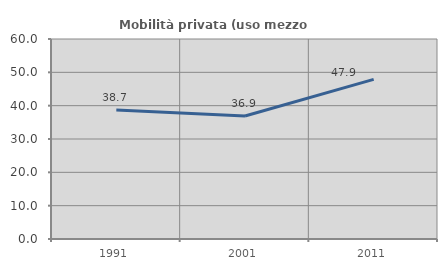
| Category | Mobilità privata (uso mezzo privato) |
|---|---|
| 1991.0 | 38.701 |
| 2001.0 | 36.897 |
| 2011.0 | 47.902 |